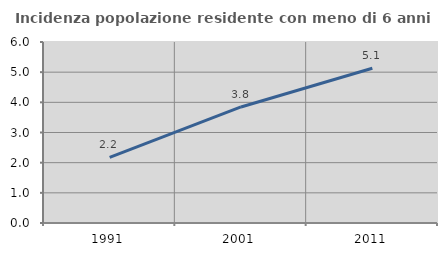
| Category | Incidenza popolazione residente con meno di 6 anni |
|---|---|
| 1991.0 | 2.174 |
| 2001.0 | 3.846 |
| 2011.0 | 5.128 |